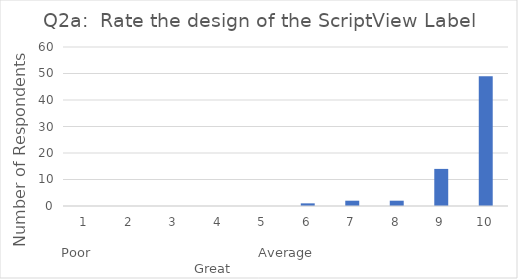
| Category | Series 0 |
|---|---|
| 0 | 0 |
| 1 | 0 |
| 2 | 0 |
| 3 | 0 |
| 4 | 0 |
| 5 | 1 |
| 6 | 2 |
| 7 | 2 |
| 8 | 14 |
| 9 | 49 |